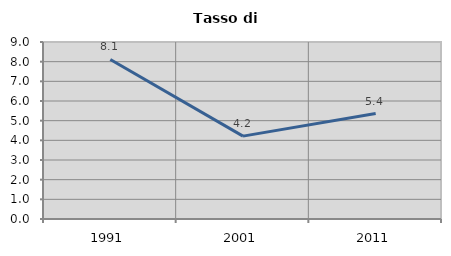
| Category | Tasso di disoccupazione   |
|---|---|
| 1991.0 | 8.113 |
| 2001.0 | 4.213 |
| 2011.0 | 5.364 |